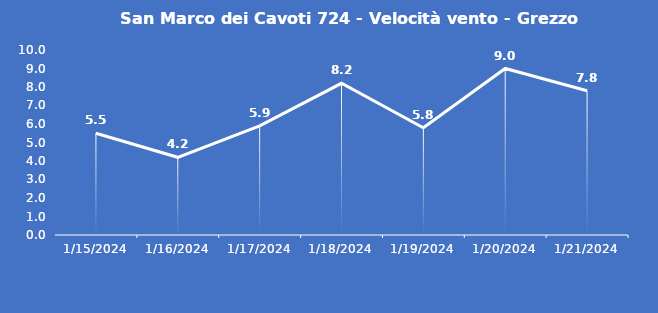
| Category | San Marco dei Cavoti 724 - Velocità vento - Grezzo (m/s) |
|---|---|
| 1/15/24 | 5.5 |
| 1/16/24 | 4.2 |
| 1/17/24 | 5.9 |
| 1/18/24 | 8.2 |
| 1/19/24 | 5.8 |
| 1/20/24 | 9 |
| 1/21/24 | 7.8 |